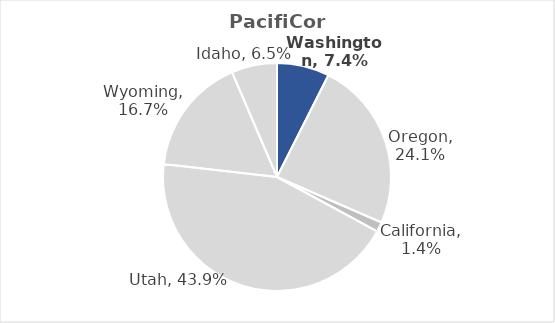
| Category | Series 0 |
|---|---|
| Washington | 0.074 |
| Oregon | 0.241 |
| California | 0.014 |
| Utah | 0.439 |
| Wyoming | 0.167 |
| Idaho | 0.065 |